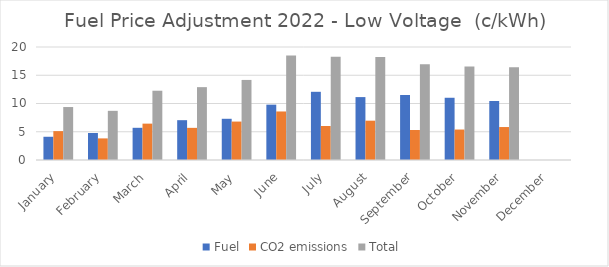
| Category | Fuel | CO2 emissions | Total |
|---|---|---|---|
| January | 4.113 | 5.111 | 9.374 |
| February | 4.777 | 3.824 | 8.702 |
| March | 5.699 | 6.436 | 12.262 |
| April | 7.048 | 5.69 | 12.896 |
| May | 7.294 | 6.802 | 14.171 |
| June | 9.796 | 8.589 | 18.513 |
| July | 12.071 | 6.015 | 18.253 |
| August | 11.134 | 6.959 | 18.22 |
| September | 11.503 | 5.314 | 16.953 |
| October | 11.015 | 5.392 | 16.551 |
| November | 10.438 | 5.835 | 16.399 |
| December | 0 | 0 | 0 |